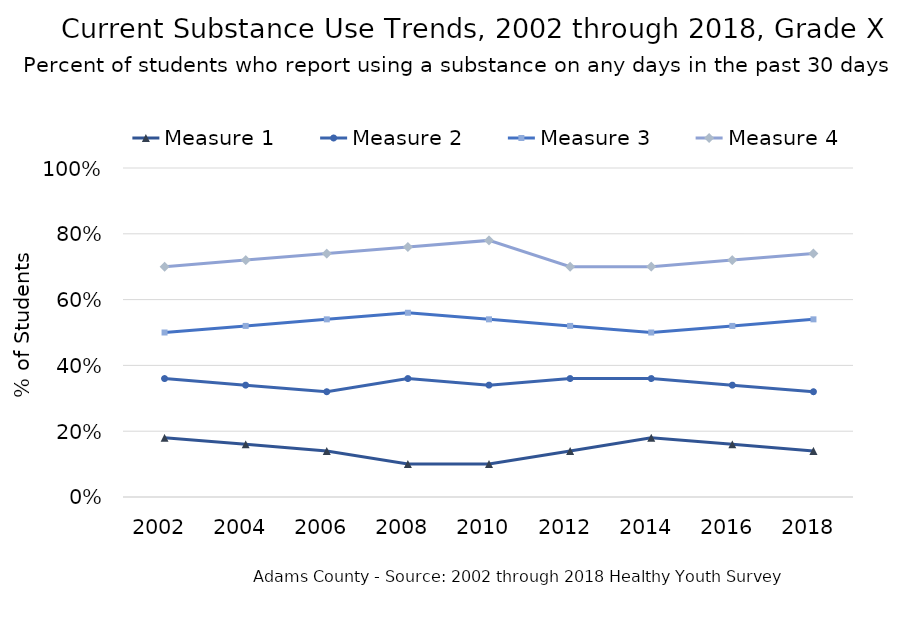
| Category | Measure 1 | Measure 2 | Measure 3 | Measure 4 |
|---|---|---|---|---|
| 2002.0 | 0.18 | 0.36 | 0.5 | 0.7 |
| 2004.0 | 0.16 | 0.34 | 0.52 | 0.72 |
| 2006.0 | 0.14 | 0.32 | 0.54 | 0.74 |
| 2008.0 | 0.1 | 0.36 | 0.56 | 0.76 |
| 2010.0 | 0.1 | 0.34 | 0.54 | 0.78 |
| 2012.0 | 0.14 | 0.36 | 0.52 | 0.7 |
| 2014.0 | 0.18 | 0.36 | 0.5 | 0.7 |
| 2016.0 | 0.16 | 0.34 | 0.52 | 0.72 |
| 2018.0 | 0.14 | 0.32 | 0.54 | 0.74 |